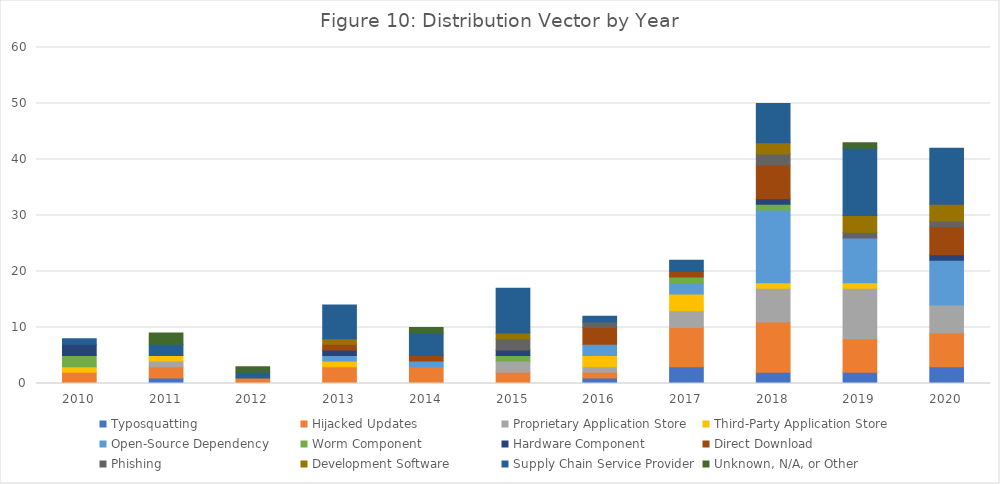
| Category | Typosquatting | Hijacked Updates | Proprietary Application Store | Third-Party Application Store | Open-Source Dependency | Worm Component | Hardware Component | Direct Download | Phishing | Development Software | Supply Chain Service Provider | Unknown, N/A, or Other |
|---|---|---|---|---|---|---|---|---|---|---|---|---|
| 2010.0 | 0 | 2 | 0 | 1 | 0 | 2 | 2 | 0 | 0 | 0 | 1 | 0 |
| 2011.0 | 1 | 2 | 1 | 1 | 0 | 0 | 0 | 0 | 0 | 0 | 2 | 2 |
| 2012.0 | 0 | 1 | 0 | 0 | 0 | 0 | 0 | 0 | 0 | 0 | 1 | 1 |
| 2013.0 | 0 | 3 | 0 | 1 | 1 | 0 | 1 | 1 | 0 | 1 | 6 | 0 |
| 2014.0 | 0 | 3 | 0 | 0 | 1 | 0 | 0 | 1 | 0 | 0 | 4 | 1 |
| 2015.0 | 0 | 2 | 2 | 0 | 0 | 1 | 1 | 0 | 2 | 1 | 8 | 0 |
| 2016.0 | 1 | 1 | 1 | 2 | 2 | 0 | 0 | 3 | 1 | 0 | 1 | 0 |
| 2017.0 | 3 | 7 | 3 | 3 | 2 | 1 | 0 | 1 | 0 | 0 | 2 | 0 |
| 2018.0 | 2 | 9 | 6 | 1 | 13 | 1 | 1 | 6 | 2 | 2 | 7 | 0 |
| 2019.0 | 2 | 6 | 9 | 1 | 8 | 0 | 0 | 0 | 1 | 3 | 12 | 1 |
| 2020.0 | 3 | 6 | 5 | 0 | 8 | 0 | 1 | 5 | 1 | 3 | 10 | 0 |